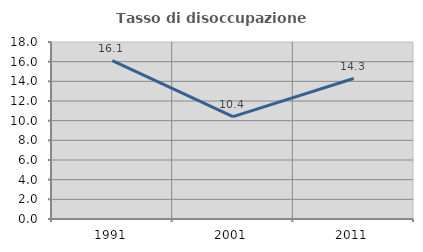
| Category | Tasso di disoccupazione giovanile  |
|---|---|
| 1991.0 | 16.102 |
| 2001.0 | 10.417 |
| 2011.0 | 14.286 |